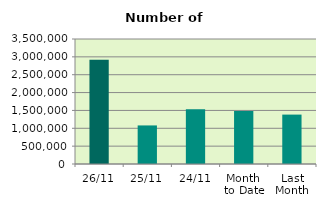
| Category | Series 0 |
|---|---|
| 26/11 | 2918374 |
| 25/11 | 1079864 |
| 24/11 | 1533158 |
| Month 
to Date | 1484092.3 |
| Last
Month | 1383348.571 |